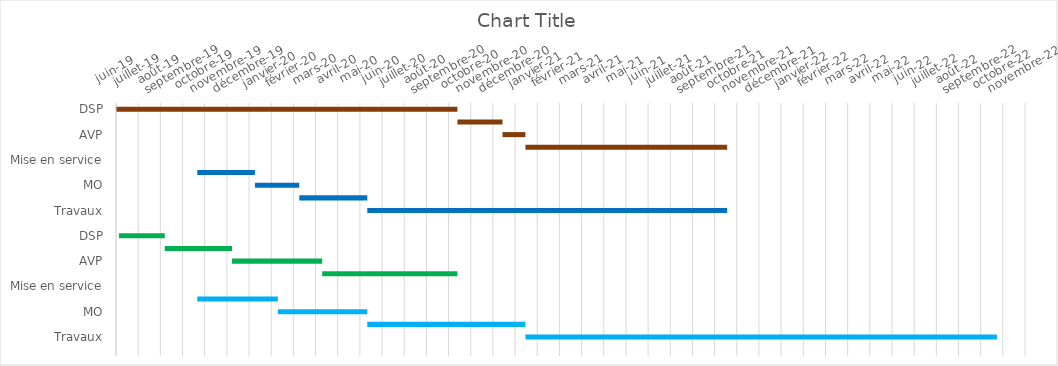
| Category | début | intervalle |
|---|---|---|
| DSP | 2019-06-27 | 462 |
| MO | 2020-10-01 | 61 |
| AVP | 2020-12-01 | 31 |
| Travaux | 2021-01-01 | 273 |
| Mise en service | 2021-10-01 | 0 |
| DSP | 2019-10-15 | 78 |
| MO | 2020-01-01 | 60 |
| AVP | 2020-03-01 | 92 |
| Travaux | 2020-06-01 | 487 |
| Mise en service | 2021-10-01 | 0 |
| DSP | 2019-07-01 | 62 |
| MO | 2019-09-01 | 91 |
| AVP | 2019-12-01 | 122 |
| Travaux | 2020-04-01 | 183 |
| Mise en service | 2020-10-01 | 0 |
| DSP | 2019-10-15 | 109 |
| MO | 2020-02-01 | 121 |
| AVP | 2020-06-01 | 214 |
| Travaux | 2021-01-01 | 638 |
| Mise en service | 2022-10-01 | 0 |